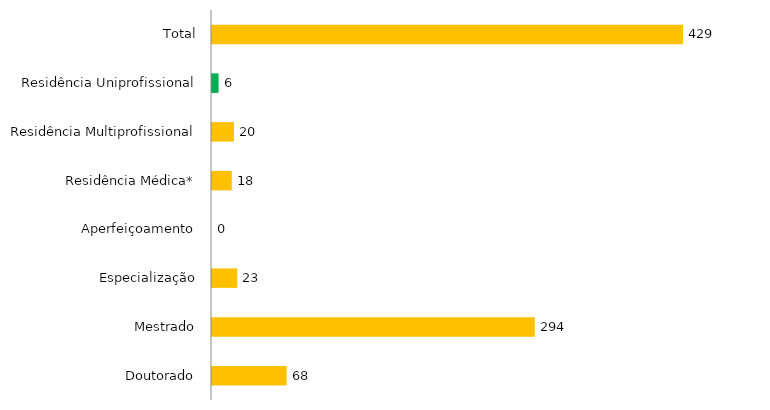
| Category | Pós - Graduação UFGD |
|---|---|
| Doutorado | 68 |
| Mestrado | 294 |
| Especialização | 23 |
| Aperfeiçoamento | 0 |
| Residência Médica* | 18 |
| Residência Multiprofissional | 20 |
| Residência Uniprofissional | 6 |
| Total | 429 |